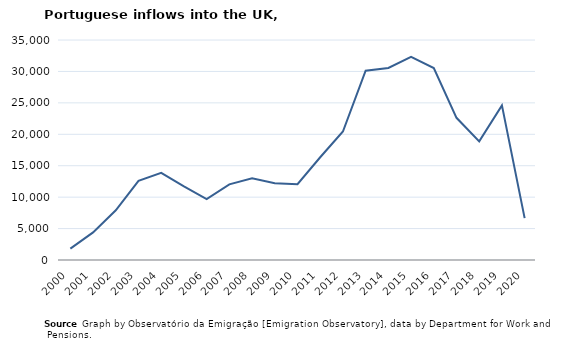
| Category | Entradas |
|---|---|
| 2000.0 | 1811 |
| 2001.0 | 4396 |
| 2002.0 | 7915 |
| 2003.0 | 12603 |
| 2004.0 | 13867 |
| 2005.0 | 11712 |
| 2006.0 | 9696 |
| 2007.0 | 12039 |
| 2008.0 | 12983 |
| 2009.0 | 12211 |
| 2010.0 | 12064 |
| 2011.0 | 16347 |
| 2012.0 | 20443 |
| 2013.0 | 30121 |
| 2014.0 | 30546 |
| 2015.0 | 32301 |
| 2016.0 | 30543 |
| 2017.0 | 22622 |
| 2018.0 | 18871 |
| 2019.0 | 24593 |
| 2020.0 | 6664 |